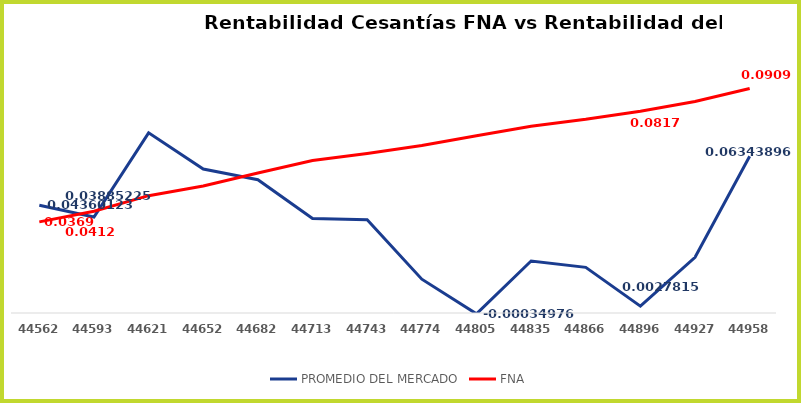
| Category | PROMEDIO DEL MERCADO |
|---|---|
| 44562.0 | 0.044 |
| 44593.0 | 0.039 |
| 44621.0 | 0.073 |
| 44652.0 | 0.058 |
| 44682.0 | 0.054 |
| 44713.0 | 0.038 |
| 44743.0 | 0.038 |
| 44774.0 | 0.014 |
| 44805.0 | 0 |
| 44835.0 | 0.021 |
| 44866.0 | 0.018 |
| 44896.0 | 0.003 |
| 44927.0 | 0.023 |
| 44958.0 | 0.063 |